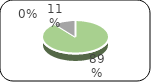
| Category | Series 0 |
|---|---|
| 0 | 10302585.44 |
| 1 | 0 |
| 2 | 1258374.05 |